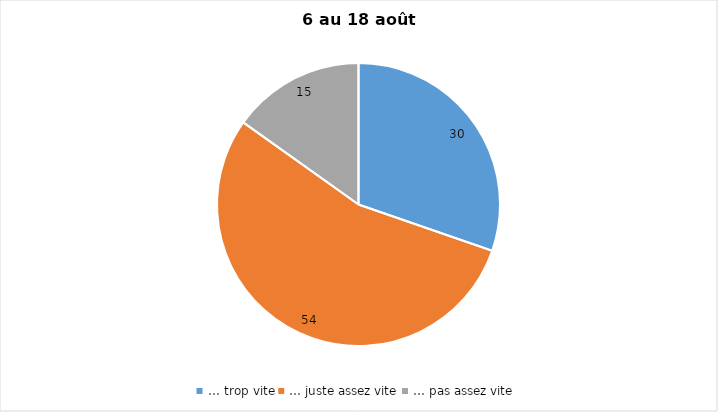
| Category | Series 0 |
|---|---|
| … trop vite | 30 |
| … juste assez vite | 54 |
| … pas assez vite | 15 |